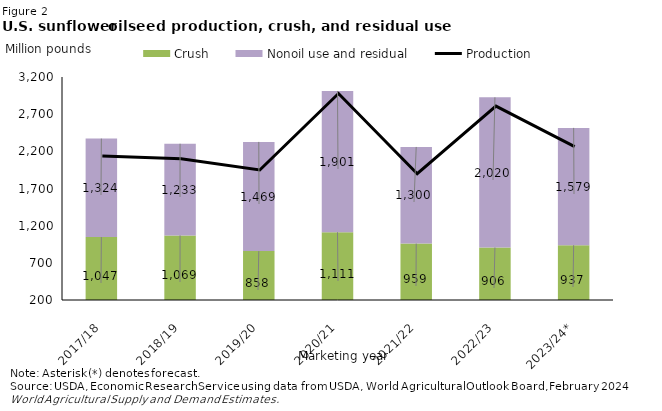
| Category | Crush | Nonoil use and residual |
|---|---|---|
| 2017/18 | 1047.196 | 1323.958 |
| 2018/19 | 1069.242 | 1233.135 |
| 2019/20 | 857.598 | 1469.321 |
| 2020/21 | 1111.13 | 1901.142 |
| 2021/22 | 959.011 | 1300.106 |
| 2022/23 | 906.1 | 2020.237 |
| 2023/24* | 936.965 | 1578.512 |